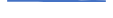
| Category | Series 0 |
|---|---|
| 0 | 68 |
| 1 | 68 |
| 2 | 74 |
| 3 | 55 |
| 4 | 53 |
| 5 | 66 |
| 6 | 43 |
| 7 | 51 |
| 8 | 42 |